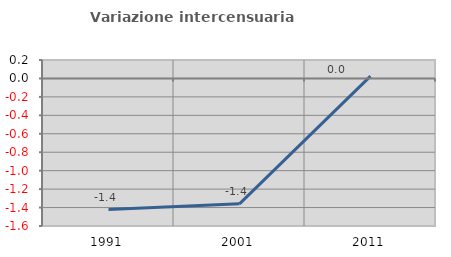
| Category | Variazione intercensuaria annua |
|---|---|
| 1991.0 | -1.422 |
| 2001.0 | -1.36 |
| 2011.0 | 0.026 |